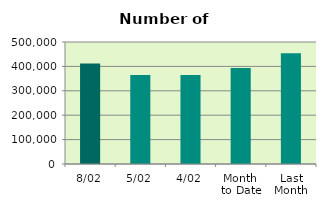
| Category | Series 0 |
|---|---|
| 8/02 | 412230 |
| 5/02 | 364530 |
| 4/02 | 364462 |
| Month 
to Date | 393912.333 |
| Last
Month | 453736.6 |